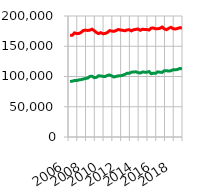
| Category | Vollzeit | Teilzeit |
|---|---|---|
| 2006.0 | 167800 | 91700 |
| 2006.0 | 168300 | 92300 |
| 2006.0 | 172100 | 93300 |
| 2006.0 | 171100 | 93200 |
| 2007.0 | 171100 | 94400 |
| 2007.0 | 172800 | 94900 |
| 2007.0 | 176000 | 95800 |
| 2007.0 | 176600 | 96700 |
| 2008.0 | 176100 | 97400 |
| 2008.0 | 176600 | 100100 |
| 2008.0 | 178200 | 100500 |
| 2008.0 | 175700 | 98100 |
| 2009.0 | 172700 | 98600 |
| 2009.0 | 170900 | 101100 |
| 2009.0 | 172500 | 100900 |
| 2009.0 | 170700 | 100200 |
| 2010.0 | 171100 | 100100 |
| 2010.0 | 172700 | 101700 |
| 2010.0 | 175800 | 102600 |
| 2010.0 | 175100 | 100900 |
| 2011.0 | 174600 | 99200 |
| 2011.0 | 176100 | 100200 |
| 2011.0 | 177700 | 101000 |
| 2011.0 | 176800 | 101200 |
| 2012.0 | 176300 | 102100 |
| 2012.0 | 175600 | 103400 |
| 2012.0 | 177000 | 105300 |
| 2012.0 | 177200 | 105300 |
| 2013.0 | 175400 | 107200 |
| 2013.0 | 177300 | 107300 |
| 2013.0 | 177900 | 107800 |
| 2013.0 | 178500 | 106400 |
| 2014.0 | 176400 | 105800 |
| 2014.0 | 178100 | 107400 |
| 2014.0 | 177700 | 107200 |
| 2014.0 | 177700 | 107000 |
| 2015.0 | 176800 | 108200 |
| 2015.0 | 179900 | 104600 |
| 2015.0 | 180200 | 105400 |
| 2015.0 | 178800 | 105200 |
| 2016.0 | 178900 | 107700 |
| 2016.0 | 179700 | 107100 |
| 2016.0 | 181800 | 106800 |
| 2016.0 | 178600 | 109500 |
| 2017.0 | 177400 | 109600 |
| 2017.0 | 179600 | 108900 |
| 2017.0 | 181300 | 109500 |
| 2017.0 | 179000 | 111100 |
| 2018.0 | 178500 | 111100 |
| 2018.0 | 179400 | 111700 |
| 2018.0 | 180700 | 113100 |
| 2018.0 | 180000 | 112900 |